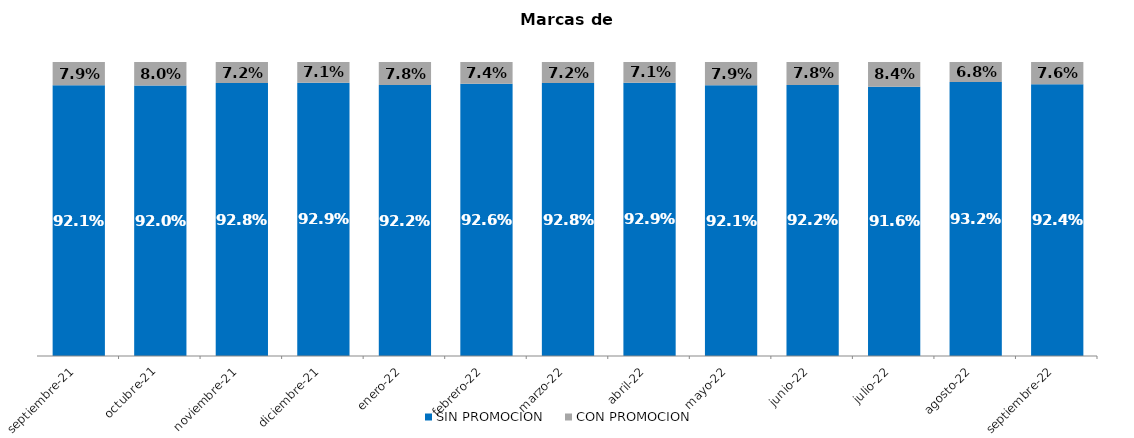
| Category | SIN PROMOCION   | CON PROMOCION   |
|---|---|---|
| 2021-09-01 | 0.921 | 0.079 |
| 2021-10-01 | 0.92 | 0.08 |
| 2021-11-01 | 0.928 | 0.072 |
| 2021-12-01 | 0.929 | 0.071 |
| 2022-01-01 | 0.922 | 0.078 |
| 2022-02-01 | 0.926 | 0.074 |
| 2022-03-01 | 0.928 | 0.072 |
| 2022-04-01 | 0.929 | 0.071 |
| 2022-05-01 | 0.921 | 0.079 |
| 2022-06-01 | 0.922 | 0.078 |
| 2022-07-01 | 0.916 | 0.084 |
| 2022-08-01 | 0.932 | 0.068 |
| 2022-09-01 | 0.924 | 0.076 |